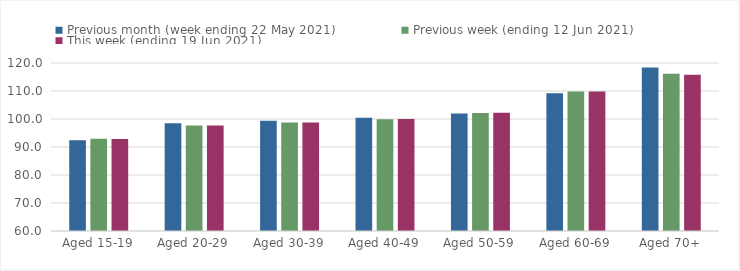
| Category | Previous month (week ending 22 May 2021) | Previous week (ending 12 Jun 2021) | This week (ending 19 Jun 2021) |
|---|---|---|---|
| Aged 15-19 | 92.38 | 92.95 | 92.84 |
| Aged 20-29 | 98.5 | 97.71 | 97.7 |
| Aged 30-39 | 99.37 | 98.71 | 98.75 |
| Aged 40-49 | 100.46 | 99.91 | 99.96 |
| Aged 50-59 | 101.99 | 102.15 | 102.24 |
| Aged 60-69 | 109.21 | 109.8 | 109.84 |
| Aged 70+ | 118.41 | 116.17 | 115.76 |